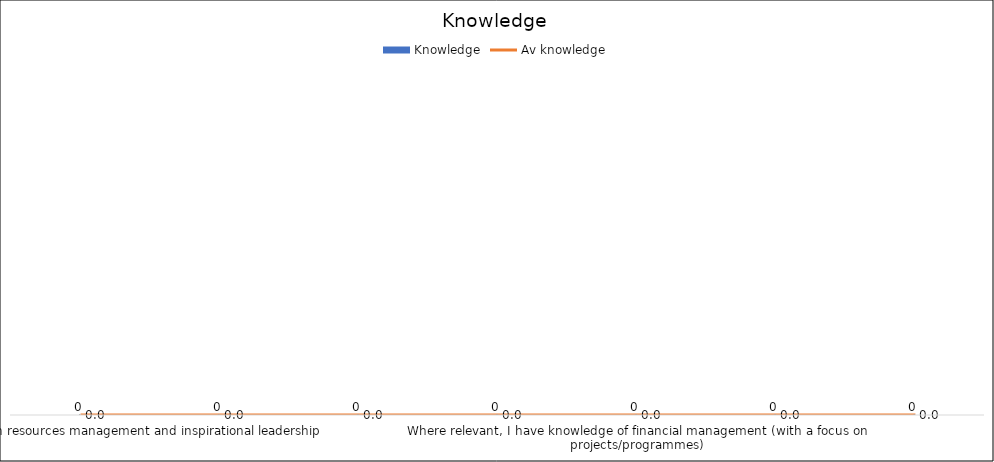
| Category | Knowledge |
|---|---|
| I have knowledge of human resources management and inspirational leadership | 0 |
| I know about system dynamics and systemic approaches to human relations | 0 |
| I know about emotional mechanisms in groups and with individuals | 0 |
| I know the target groups and their surrounding community (e.g. friends, family, colleagues, etc.) | 0 |
| Where relevant, I have knowledge of financial management (with a focus on projects/programmes) | 0 |
| Where relevant, I have knowledge of fundraising | 0 |
| I know relevant policy and legislation on specific topics (e.g. health)  | 0 |